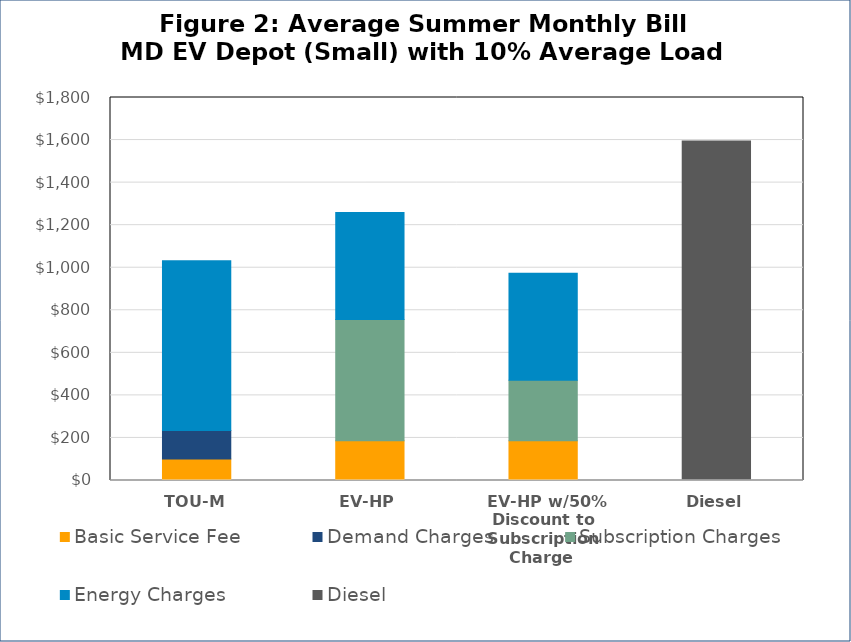
| Category | Basic Service Fee | Demand Charges | Subscription Charges | Energy Charges | Diesel |
|---|---|---|---|---|---|
|  TOU-M  | 101.56 | 133.2 | 0 | 798.574 | 0 |
|  EV-HP  | 186.304 | 0 | 570.02 | 502.879 | 0 |
|  EV-HP w/50% Discount to Subscription Charge  | 186.304 | 0 | 285.01 | 502.879 | 0 |
|  Diesel  | 0 | 0 | 0 | 0 | 1594.974 |